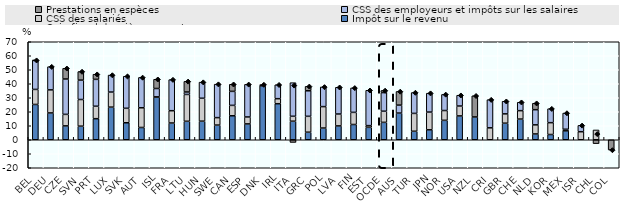
| Category | Impôt sur le revenu | CSS des salariés | CSS des employeurs et impôts sur les salaires | Prestations en espèces |
|---|---|---|---|---|
| BEL | 25.214 | 10.739 | 20.712 | 0.148 |
| DEU | 19.161 | 16.47 | 16.572 | 0 |
| CZE | 9.912 | 8.221 | 25.262 | 7.638 |
| SVN | 9.707 | 19.035 | 13.867 | 6.114 |
| PRT | 15.056 | 8.889 | 19.192 | 3.673 |
| LUX | 23.306 | 10.757 | 12.157 | 0 |
| SVK | 12.138 | 10.332 | 22.899 | 0 |
| AUT | 8.763 | 14.082 | 21.666 | 0 |
| ISL | 30.466 | 0.174 | 5.971 | 6.596 |
| FRA | 11.953 | 8.8 | 22.194 | 0 |
| LTU | 13.201 | 19.157 | 1.759 | 7.587 |
| HUN | 13.274 | 16.372 | 11.504 | 0 |
| SWE | 10.48 | 5.326 | 23.908 | 0 |
| CAN | 17.122 | 7.432 | 10 | 5.082 |
| ESP | 11.327 | 4.946 | 23.313 | 0 |
| DNK | 38.508 | 0 | 0.909 | 0 |
| IRL | 25.738 | 3.602 | 9.95 | 0 |
| ITA | 13.243 | 3.529 | 24.001 | -1.903 |
| GRC | 5.401 | 11.342 | 18.227 | 3.168 |
| POL | 8.36 | 15.32 | 14.06 | 0 |
| LVA | 9.893 | 8.493 | 19.11 | 0 |
| FIN | 10.901 | 8.658 | 17.492 | 0 |
| EST | 8.884 | 1.196 | 25.262 | 0 |
| OCDE | 12.429 | 7.957 | 13.299 | 1.514 |
| AUS | 19.062 | 0 | 5.68 | 9.754 |
| TUR | 6.062 | 12.766 | 14.894 | 0 |
| JPN | 7.102 | 12.672 | 13.502 | 0 |
| NOR | 13.882 | 6.991 | 11.504 | 0 |
| USA | 17.026 | 7.06 | 7.718 | 0 |
| NZL | 16.292 | 0 | 0 | 15.125 |
| CRI | 0 | 8.524 | 20.109 | 0 |
| GBR | 11.822 | 6.667 | 9.017 | 0 |
| CHE | 14.77 | 6.015 | 6.015 | 0 |
| NLD | 4.142 | 6.502 | 10.832 | 4.625 |
| KOR | 3.746 | 8.462 | 9.974 | 0 |
| MEX | 6.379 | 1.112 | 11.592 | 0 |
| ISR | 0 | 5.737 | 4.531 | 0 |
| CHL | 0 | 7 | 0 | -2.772 |
| COL | 0 | 0 | 0 | -7.289 |